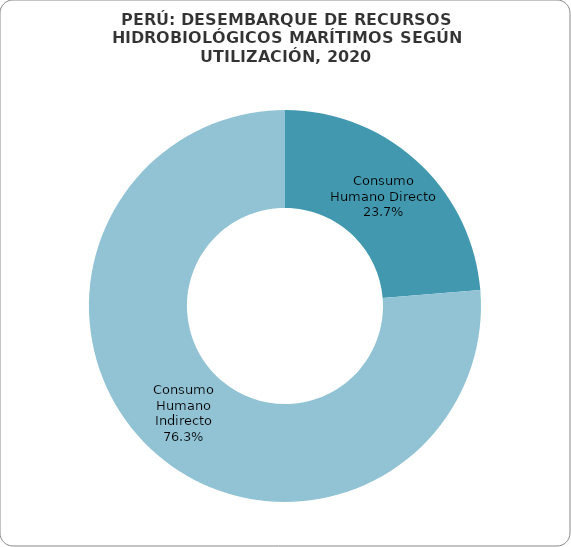
| Category | Series 0 |
|---|---|
| Consumo Humano Directo | 1342117.15 |
| Consumo Humano Indirecto | 4320756.96 |